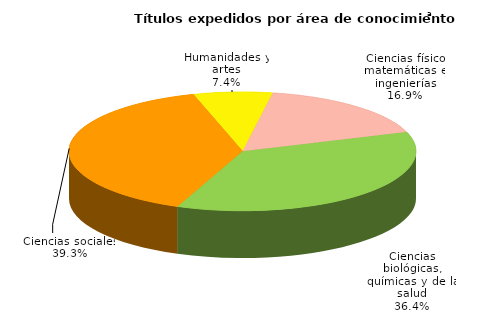
| Category | Series 0 |
|---|---|
| Ciencias físico matemáticas e ingenierías | 3987 |
| Ciencias biológicas, químicas y de la salud | 8576 |
| Ciencias sociales | 9262 |
| Humanidades y artes | 1735 |